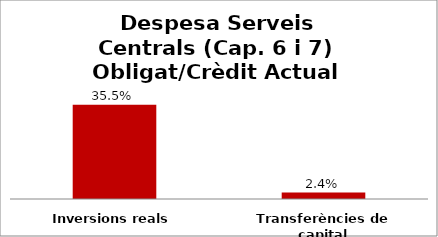
| Category | Series 0 |
|---|---|
| Inversions reals | 0.355 |
| Transferències de capital | 0.024 |